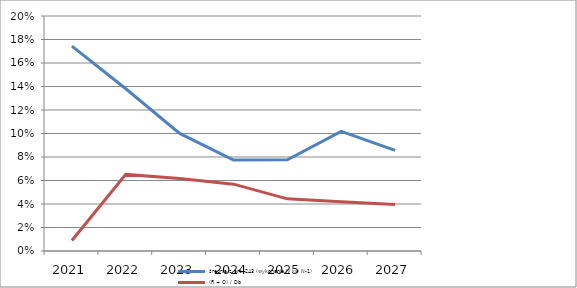
| Category | średnia z art. 243 (wykonanie IV kw N-1) | (R + O) / Db |
|---|---|---|
| 2021.0 | 0.174 | 0.009 |
| 2022.0 | 0.138 | 0.065 |
| 2023.0 | 0.1 | 0.062 |
| 2024.0 | 0.077 | 0.057 |
| 2025.0 | 0.078 | 0.044 |
| 2026.0 | 0.102 | 0.042 |
| 2027.0 | 0.086 | 0.04 |